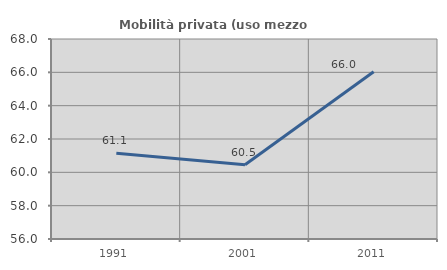
| Category | Mobilità privata (uso mezzo privato) |
|---|---|
| 1991.0 | 61.144 |
| 2001.0 | 60.457 |
| 2011.0 | 66.032 |